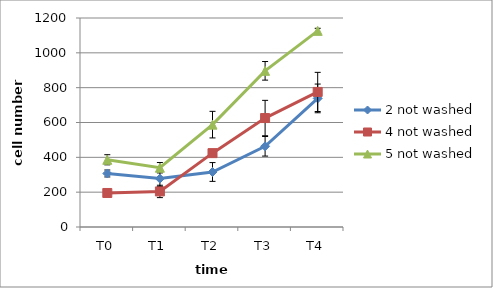
| Category | 2 not washed | 4 not washed | 5 not washed |
|---|---|---|---|
| T0 | 307.333 | 195.333 | 386 |
| T1 | 277.889 | 204.222 | 340.333 |
| T2 | 315.926 | 424.074 | 587.778 |
| T3 | 463.333 | 625.556 | 896.667 |
| T4 | 738.333 | 775.556 | 1126.111 |